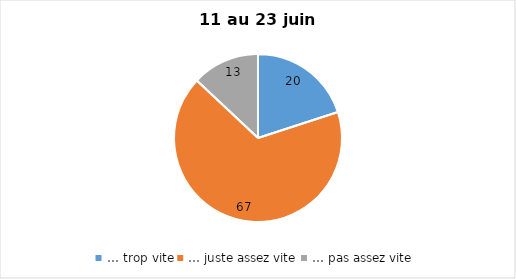
| Category | Series 0 |
|---|---|
| … trop vite | 20 |
| … juste assez vite | 67 |
| … pas assez vite | 13 |